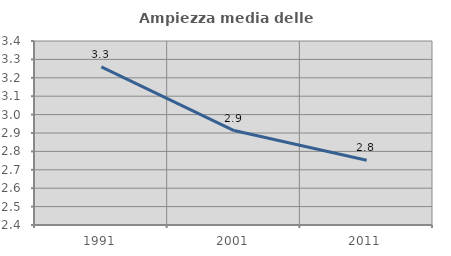
| Category | Ampiezza media delle famiglie |
|---|---|
| 1991.0 | 3.259 |
| 2001.0 | 2.913 |
| 2011.0 | 2.752 |